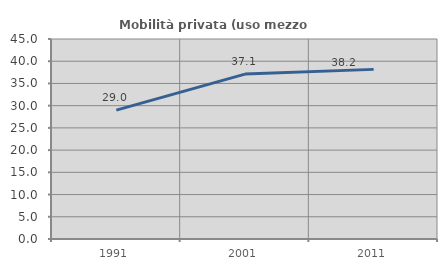
| Category | Mobilità privata (uso mezzo privato) |
|---|---|
| 1991.0 | 28.998 |
| 2001.0 | 37.103 |
| 2011.0 | 38.166 |